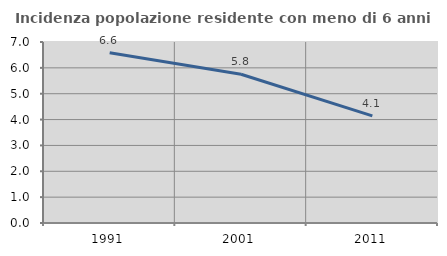
| Category | Incidenza popolazione residente con meno di 6 anni |
|---|---|
| 1991.0 | 6.585 |
| 2001.0 | 5.752 |
| 2011.0 | 4.145 |